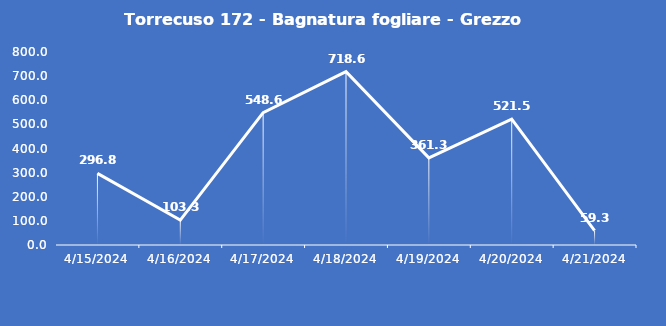
| Category | Torrecuso 172 - Bagnatura fogliare - Grezzo (min) |
|---|---|
| 4/15/24 | 296.8 |
| 4/16/24 | 103.3 |
| 4/17/24 | 548.6 |
| 4/18/24 | 718.6 |
| 4/19/24 | 361.3 |
| 4/20/24 | 521.5 |
| 4/21/24 | 59.3 |